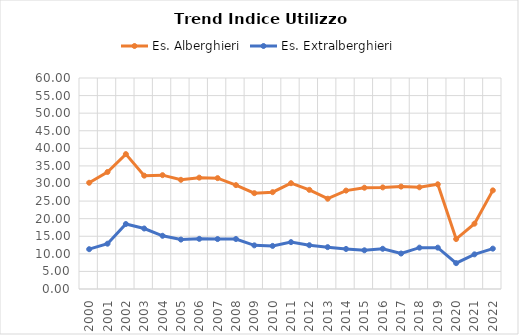
| Category | Es. Alberghieri | Es. Extralberghieri |
|---|---|---|
| 2000.0 | 30.21 | 11.321 |
| 2001.0 | 33.272 | 12.885 |
| 2002.0 | 38.354 | 18.476 |
| 2003.0 | 32.232 | 17.201 |
| 2004.0 | 32.371 | 15.133 |
| 2005.0 | 31.047 | 14.056 |
| 2006.0 | 31.666 | 14.262 |
| 2007.0 | 31.525 | 14.204 |
| 2008.0 | 29.541 | 14.219 |
| 2009.0 | 27.255 | 12.414 |
| 2010.0 | 27.536 | 12.252 |
| 2011.0 | 30.085 | 13.326 |
| 2012.0 | 28.2 | 12.45 |
| 2013.0 | 25.674 | 11.905 |
| 2014.0 | 27.983 | 11.389 |
| 2015.0 | 28.799 | 11.006 |
| 2016.0 | 28.892 | 11.433 |
| 2017.0 | 29.122 | 10.091 |
| 2018.0 | 28.921 | 11.757 |
| 2019.0 | 29.774 | 11.76 |
| 2020.0 | 14.207 | 7.353 |
| 2021.0 | 18.575 | 9.854 |
| 2022.0 | 28.047 | 11.477 |